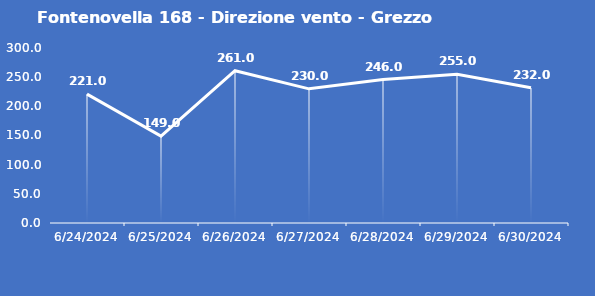
| Category | Fontenovella 168 - Direzione vento - Grezzo (°N) |
|---|---|
| 6/24/24 | 221 |
| 6/25/24 | 149 |
| 6/26/24 | 261 |
| 6/27/24 | 230 |
| 6/28/24 | 246 |
| 6/29/24 | 255 |
| 6/30/24 | 232 |